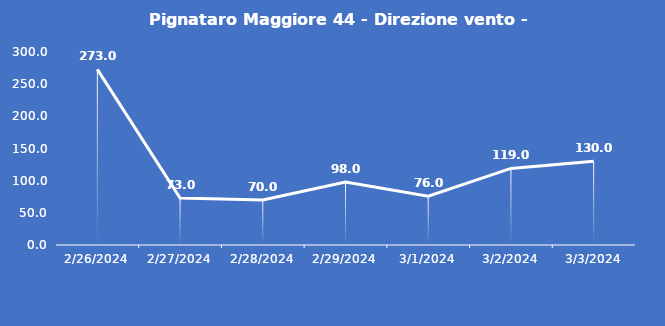
| Category | Pignataro Maggiore 44 - Direzione vento - Grezzo (°N) |
|---|---|
| 2/26/24 | 273 |
| 2/27/24 | 73 |
| 2/28/24 | 70 |
| 2/29/24 | 98 |
| 3/1/24 | 76 |
| 3/2/24 | 119 |
| 3/3/24 | 130 |